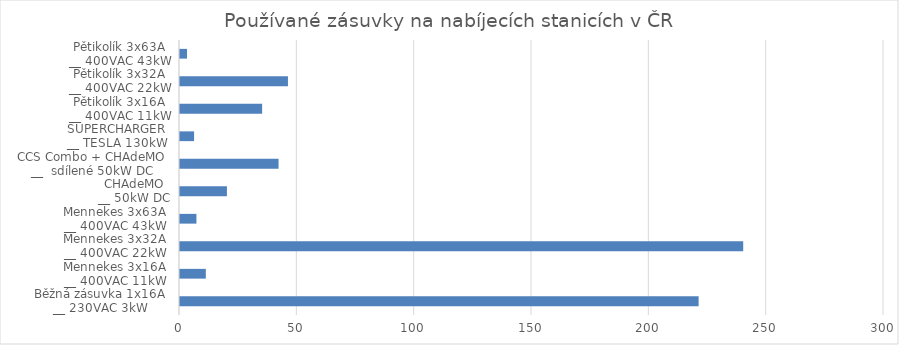
| Category | Series 0 |
|---|---|
| Běžná zásuvka 1x16A
__ 230VAC 3kW | 221 |
| Mennekes 3x16A
__ 400VAC 11kW | 11 |
| Mennekes 3x32A
__ 400VAC 22kW | 240 |
| Mennekes 3x63A
__ 400VAC 43kW | 7 |
| CHAdeMO
__ 50kW DC | 20 |
| CCS Combo + CHAdeMO
__  sdílené 50kW DC | 42 |
| SUPERCHARGER
__ TESLA 130kW | 6 |
| Pětikolík 3x16A
__ 400VAC 11kW | 35 |
| Pětikolík 3x32A
__ 400VAC 22kW | 46 |
| Pětikolík 3x63A
__ 400VAC 43kW | 3 |